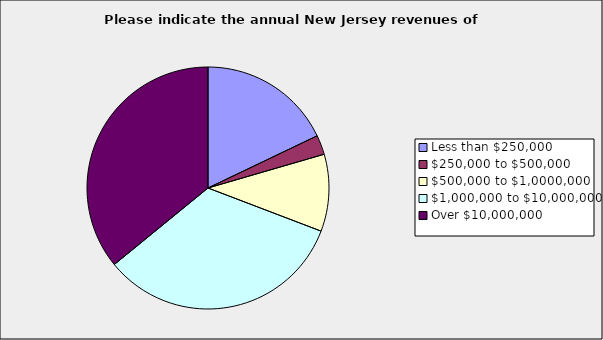
| Category | Series 0 |
|---|---|
| Less than $250,000 | 0.179 |
| $250,000 to $500,000 | 0.026 |
| $500,000 to $1,0000,000 | 0.103 |
| $1,000,000 to $10,000,000 | 0.333 |
| Over $10,000,000 | 0.359 |